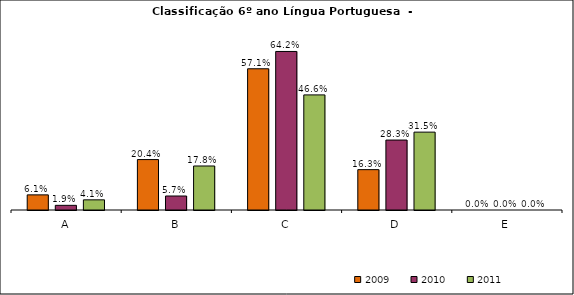
| Category | 2009 | 2010 | 2011 |
|---|---|---|---|
| A | 0.061 | 0.019 | 0.041 |
| B | 0.204 | 0.057 | 0.178 |
| C | 0.571 | 0.642 | 0.466 |
| D | 0.163 | 0.283 | 0.315 |
| E | 0 | 0 | 0 |